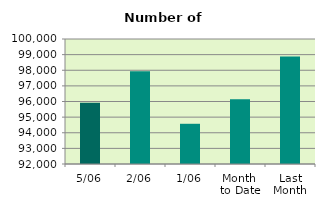
| Category | Series 0 |
|---|---|
| 5/06 | 95914 |
| 2/06 | 97938 |
| 1/06 | 94574 |
| Month 
to Date | 96142 |
| Last
Month | 98885.545 |